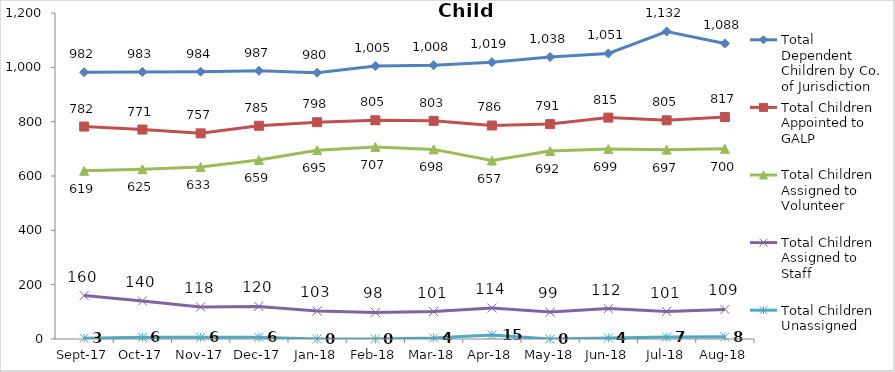
| Category | Total Dependent Children by Co. of Jurisdiction | Total Children Appointed to GALP | Total Children Assigned to Volunteer | Total Children Assigned to Staff | Total Children Unassigned |
|---|---|---|---|---|---|
| 2017-09-01 | 982 | 782 | 619 | 160 | 3 |
| 2017-10-01 | 983 | 771 | 625 | 140 | 6 |
| 2017-11-01 | 984 | 757 | 633 | 118 | 6 |
| 2017-12-01 | 987 | 785 | 659 | 120 | 6 |
| 2018-01-01 | 980 | 798 | 695 | 103 | 0 |
| 2018-02-01 | 1005 | 805 | 707 | 98 | 0 |
| 2018-03-01 | 1008 | 803 | 698 | 101 | 4 |
| 2018-04-01 | 1019 | 786 | 657 | 114 | 15 |
| 2018-05-01 | 1038 | 791 | 692 | 99 | 0 |
| 2018-06-01 | 1051 | 815 | 699 | 112 | 4 |
| 2018-07-01 | 1132 | 805 | 697 | 101 | 7 |
| 2018-08-01 | 1088 | 817 | 700 | 109 | 8 |